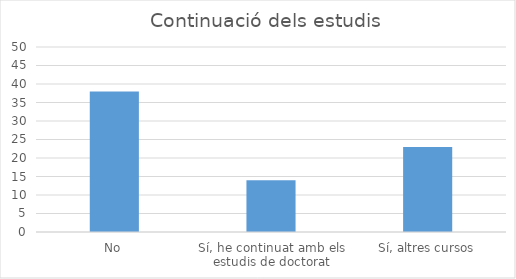
| Category | Series 0 |
|---|---|
| No | 38 |
| Sí, he continuat amb els estudis de doctorat | 14 |
| Sí, altres cursos | 23 |